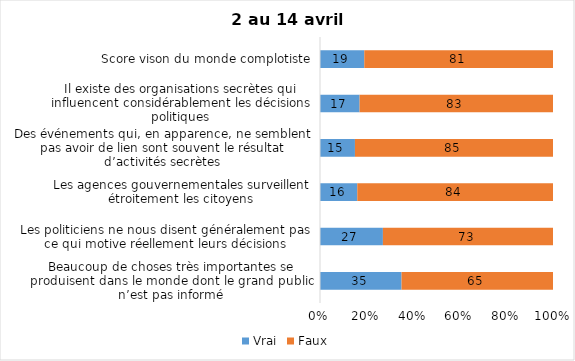
| Category | Vrai | Faux |
|---|---|---|
| Beaucoup de choses très importantes se produisent dans le monde dont le grand public n’est pas informé | 35 | 65 |
| Les politiciens ne nous disent généralement pas ce qui motive réellement leurs décisions | 27 | 73 |
| Les agences gouvernementales surveillent étroitement les citoyens | 16 | 84 |
| Des événements qui, en apparence, ne semblent pas avoir de lien sont souvent le résultat d’activités secrètes | 15 | 85 |
| Il existe des organisations secrètes qui influencent considérablement les décisions politiques | 17 | 83 |
| Score vison du monde complotiste | 19 | 81 |